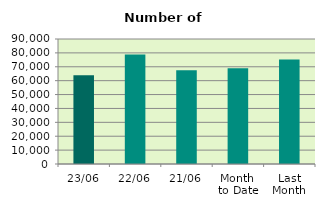
| Category | Series 0 |
|---|---|
| 23/06 | 63950 |
| 22/06 | 78804 |
| 21/06 | 67490 |
| Month 
to Date | 68916.471 |
| Last
Month | 75261.143 |